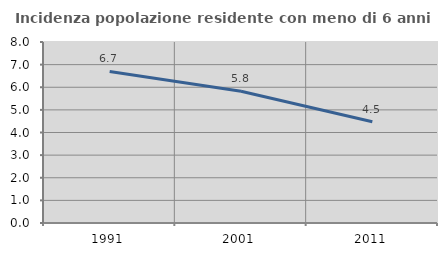
| Category | Incidenza popolazione residente con meno di 6 anni |
|---|---|
| 1991.0 | 6.701 |
| 2001.0 | 5.824 |
| 2011.0 | 4.478 |